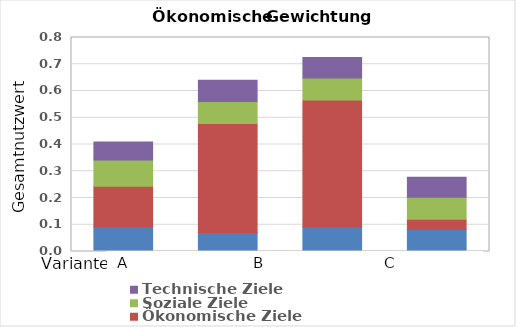
| Category | Umwelt- und Ressourcenschutz | Ökonomische Ziele | Soziale Ziele | Technische Ziele |
|---|---|---|---|---|
| 0 | 0.093 | 0.152 | 0.098 | 0.068 |
| 1 | 0.071 | 0.407 | 0.082 | 0.079 |
| 2 | 0.092 | 0.474 | 0.082 | 0.077 |
| 3 | 0.083 | 0.037 | 0.082 | 0.074 |